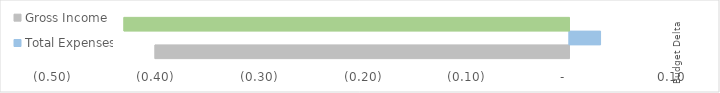
| Category | Gross Income | Total Expenses | Net Income |
|---|---|---|---|
| Budget Delta | -0.4 | 0.03 | -0.43 |